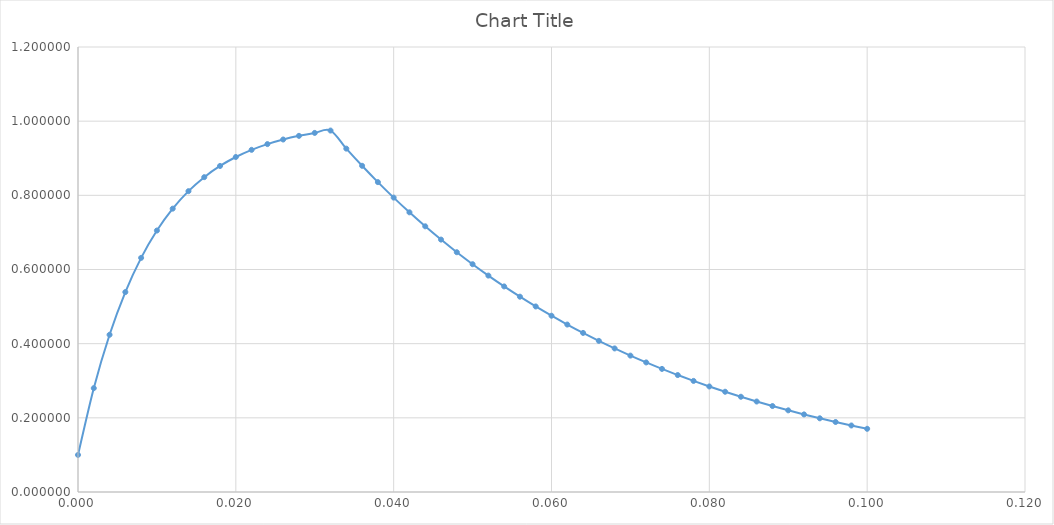
| Category | Series 0 |
|---|---|
| 0.0 | 0.1 |
| 0.002 | 0.28 |
| 0.004 | 0.424 |
| 0.006 | 0.539 |
| 0.008 | 0.631 |
| 0.01 | 0.705 |
| 0.012 | 0.764 |
| 0.014 | 0.811 |
| 0.016 | 0.849 |
| 0.018000000000000002 | 0.879 |
| 0.020000000000000004 | 0.903 |
| 0.022000000000000006 | 0.923 |
| 0.024000000000000007 | 0.938 |
| 0.02600000000000001 | 0.951 |
| 0.02800000000000001 | 0.96 |
| 0.030000000000000013 | 0.968 |
| 0.032000000000000015 | 0.975 |
| 0.034000000000000016 | 0.926 |
| 0.03600000000000002 | 0.88 |
| 0.03800000000000002 | 0.836 |
| 0.04000000000000002 | 0.794 |
| 0.04200000000000002 | 0.754 |
| 0.044000000000000025 | 0.716 |
| 0.04600000000000003 | 0.681 |
| 0.04800000000000003 | 0.647 |
| 0.05000000000000003 | 0.614 |
| 0.05200000000000003 | 0.584 |
| 0.054000000000000034 | 0.554 |
| 0.056000000000000036 | 0.527 |
| 0.05800000000000004 | 0.5 |
| 0.06000000000000004 | 0.475 |
| 0.06200000000000004 | 0.452 |
| 0.06400000000000004 | 0.429 |
| 0.06600000000000004 | 0.408 |
| 0.06800000000000005 | 0.387 |
| 0.07000000000000005 | 0.368 |
| 0.07200000000000005 | 0.349 |
| 0.07400000000000005 | 0.332 |
| 0.07600000000000005 | 0.315 |
| 0.07800000000000006 | 0.3 |
| 0.08000000000000006 | 0.285 |
| 0.08200000000000006 | 0.27 |
| 0.08400000000000006 | 0.257 |
| 0.08600000000000006 | 0.244 |
| 0.08800000000000006 | 0.232 |
| 0.09000000000000007 | 0.22 |
| 0.09200000000000007 | 0.209 |
| 0.09400000000000007 | 0.199 |
| 0.09600000000000007 | 0.189 |
| 0.09800000000000007 | 0.179 |
| 0.10000000000000007 | 0.17 |